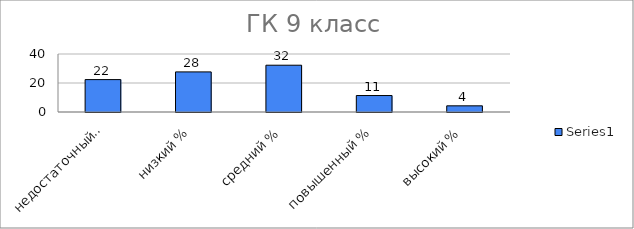
| Category | Series 0 |
|---|---|
| недостаточный % | 22.34 |
| низкий % | 27.66 |
| средний % | 32.27 |
| повышенный % | 11.348 |
| высокий % | 4.255 |